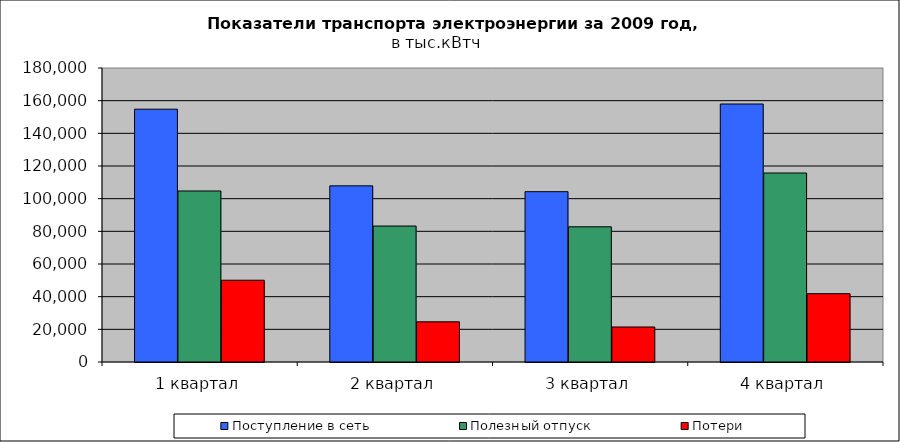
| Category | Поступление в сеть | Полезный отпуск | Потери |
|---|---|---|---|
| 1 квартал | 154767.611 | 104710.666 | 50056.945 |
| 2 квартал | 107844.121 | 83242.747 | 24601.374 |
| 3 квартал | 104277.993 | 82772.896 | 21434.673 |
| 4 квартал | 157951.703 | 115702.67 | 41827.234 |